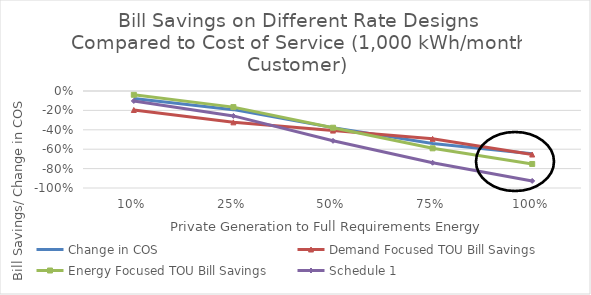
| Category | Change in COS | Demand Focused TOU Bill Savings | Energy Focused TOU Bill Savings | Schedule 1 |
|---|---|---|---|---|
| 0.1 | -0.077 | -0.196 | -0.039 | -0.103 |
| 0.25 | -0.192 | -0.323 | -0.166 | -0.257 |
| 0.5 | -0.378 | -0.408 | -0.379 | -0.514 |
| 0.75 | -0.541 | -0.493 | -0.591 | -0.74 |
| 1.0 | -0.647 | -0.655 | -0.752 | -0.927 |